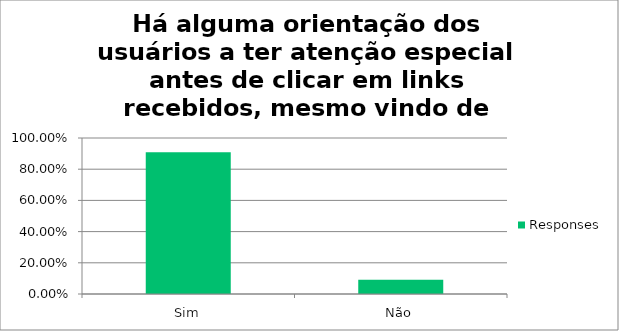
| Category | Responses |
|---|---|
| Sim | 0.908 |
| Não | 0.092 |